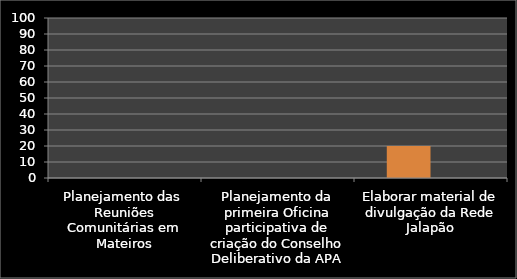
| Category | Inicio % | % |
|---|---|---|
| Planejamento das  Reuniões Comunitárias em Mateiros | 0 | 0 |
| Planejamento da primeira Oficina participativa de criação do Conselho Deliberativo da APA | 0 | 0 |
| Elaborar material de divulgação da Rede Jalapão | 20 | 0 |